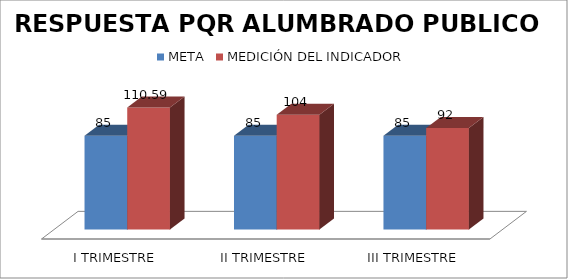
| Category | META | MEDICIÓN DEL INDICADOR |
|---|---|---|
| I TRIMESTRE | 85 | 110.59 |
| II TRIMESTRE | 85 | 104 |
| III TRIMESTRE | 85 | 92 |